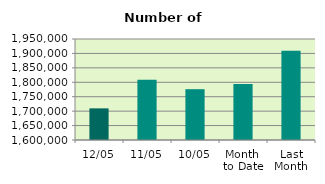
| Category | Series 0 |
|---|---|
| 12/05 | 1709600 |
| 11/05 | 1809220 |
| 10/05 | 1776124 |
| Month 
to Date | 1794026.889 |
| Last
Month | 1909115.889 |